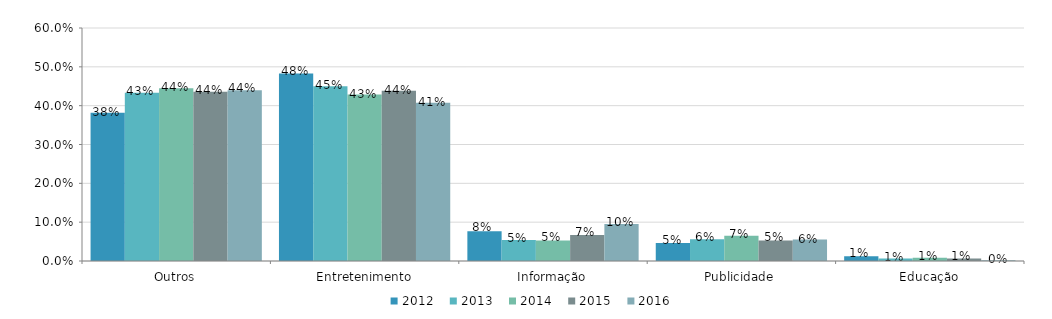
| Category | 2012 | 2013 | 2014 | 2015 | 2016 |
|---|---|---|---|---|---|
| Outros | 0.382 | 0.433 | 0.445 | 0.436 | 0.44 |
| Entretenimento | 0.483 | 0.45 | 0.429 | 0.438 | 0.408 |
| Informação | 0.077 | 0.054 | 0.053 | 0.067 | 0.096 |
| Publicidade | 0.046 | 0.056 | 0.065 | 0.053 | 0.055 |
| Educação | 0.013 | 0.007 | 0.008 | 0.006 | 0.002 |